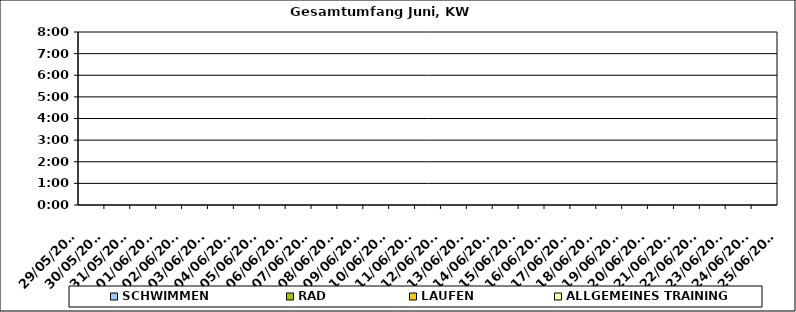
| Category | SCHWIMMEN | RAD | LAUFEN | ALLGEMEINES TRAINING |
|---|---|---|---|---|
| 29/05/2023 |  |  |  | 0 |
| 30/05/2023 |  |  |  | 0 |
| 31/05/2023 |  |  |  | 0 |
| 01/06/2023 |  |  |  | 0 |
| 02/06/2023 |  |  |  | 0 |
| 03/06/2023 |  |  |  | 0 |
| 04/06/2023 |  |  |  | 0 |
| 05/06/2023 |  |  |  | 0 |
| 06/06/2023 |  |  |  | 0 |
| 07/06/2023 |  |  |  | 0 |
| 08/06/2023 |  |  |  | 0 |
| 09/06/2023 |  |  |  | 0 |
| 10/06/2023 |  |  |  | 0 |
| 11/06/2023 |  |  |  | 0 |
| 12/06/2023 |  |  |  | 0 |
| 13/06/2023 |  |  |  | 0 |
| 14/06/2023 |  |  |  | 0 |
| 15/06/2023 |  |  |  | 0 |
| 16/06/2023 |  |  |  | 0 |
| 17/06/2023 |  |  |  | 0 |
| 18/06/2023 |  |  |  | 0 |
| 19/06/2023 |  |  |  | 0 |
| 20/06/2023 |  |  |  | 0 |
| 21/06/2023 |  |  |  | 0 |
| 22/06/2023 |  |  |  | 0 |
| 23/06/2023 |  |  |  | 0 |
| 24/06/2023 |  |  |  | 0 |
| 25/06/2023 |  |  |  | 0 |